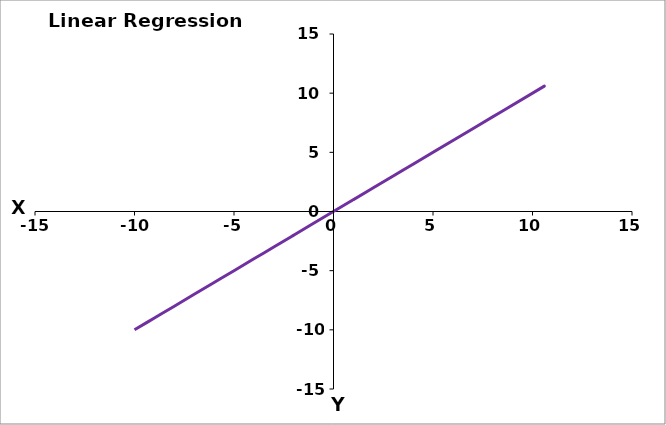
| Category | Series 0 |
|---|---|
| 1.0 | 1 |
| 2.0 | 2 |
| 3.0 | 3 |
| 4.0 | 4 |
| 5.0 | 5 |
| 6.0 | 6 |
| 7.0 | 7 |
| 8.0 | 8 |
| 9.0 | 9 |
| 10.0 | 10 |
| -1.0 | -1 |
| -2.0 | -2 |
| -3.0 | -3 |
| -4.0 | -4 |
| -5.0 | -5 |
| -6.0 | -6 |
| -7.0 | -7 |
| -8.0 | -8 |
| -9.0 | -9 |
| -10.0 | -10 |